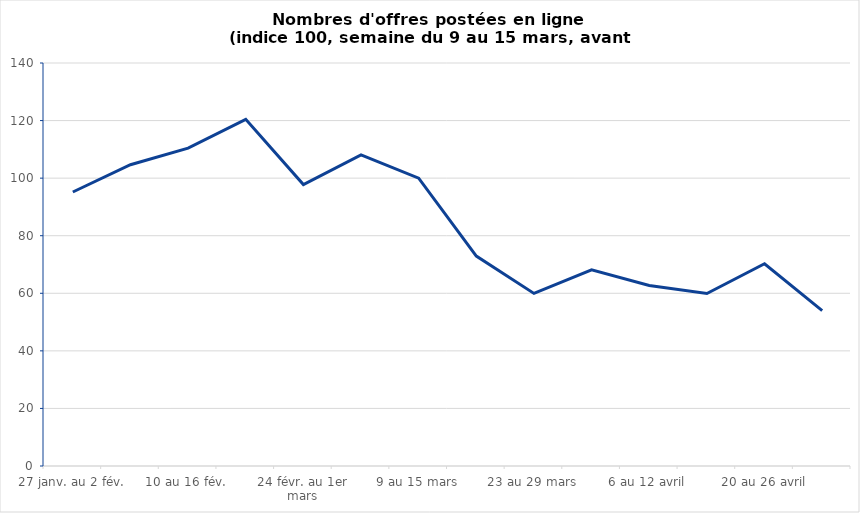
| Category | Series 0 |
|---|---|
| 27 janv. au 2 fév. | 95.185 |
| 3 au 9 fév. | 104.648 |
| 10 au 16 fév. | 110.442 |
| 17 au 23 fév. | 120.431 |
| 24 févr. au 1er mars | 97.757 |
| 2 au 8 mars | 108.052 |
| 9 au 15 mars | 100 |
| 16 au 22 mars | 72.925 |
| 23 au 29 mars | 59.965 |
| 30 mars au 5 avril | 68.123 |
| 6 au 12 avril | 62.691 |
| 13 au 19 avril | 59.916 |
| 20 au 26 avril | 70.272 |
| 27 avril au 3 mai | 54 |